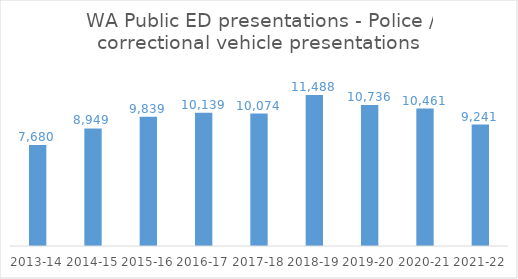
| Category | WA Public ED presentations - Police / correctional vehicle presentations  |
|---|---|
| 2013-14 | 7680 |
| 2014-15 | 8949 |
| 2015-16 | 9839 |
| 2016-17 | 10139 |
| 2017-18 | 10074 |
| 2018-19 | 11488 |
| 2019-20 | 10736 |
| 2020-21 | 10461 |
| 2021-22 | 9241 |